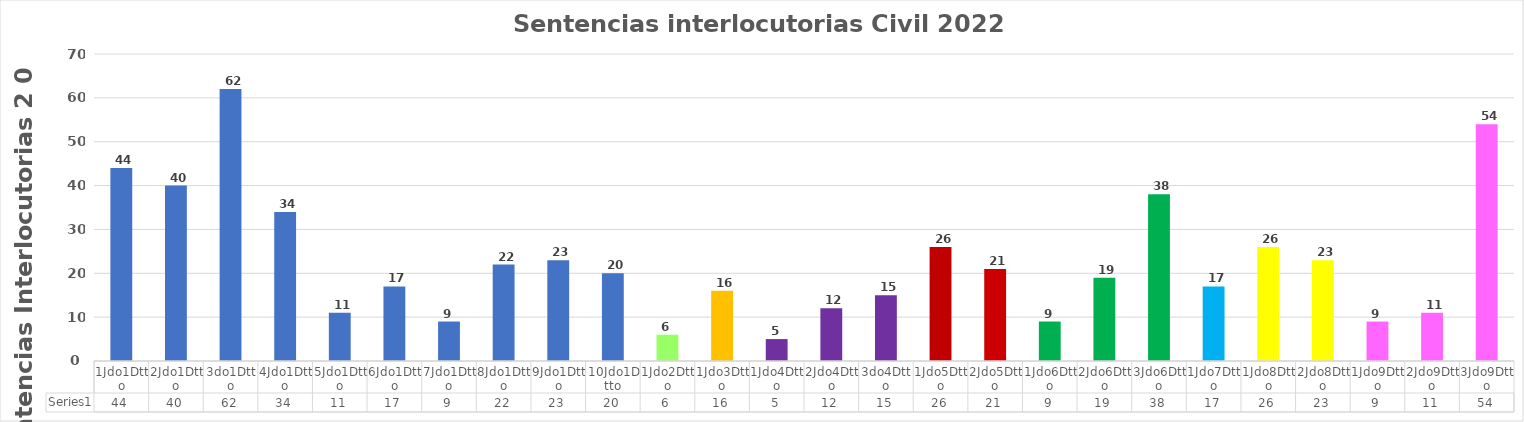
| Category | Series 0 |
|---|---|
| 1Jdo1Dtto | 44 |
| 2Jdo1Dtto | 40 |
| 3do1Dtto | 62 |
| 4Jdo1Dtto | 34 |
| 5Jdo1Dtto | 11 |
| 6Jdo1Dtto | 17 |
| 7Jdo1Dtto | 9 |
| 8Jdo1Dtto | 22 |
| 9Jdo1Dtto | 23 |
| 10Jdo1Dtto | 20 |
| 1Jdo2Dtto | 6 |
| 1Jdo3Dtto | 16 |
| 1Jdo4Dtto | 5 |
| 2Jdo4Dtto | 12 |
| 3do4Dtto | 15 |
| 1Jdo5Dtto | 26 |
| 2Jdo5Dtto | 21 |
| 1Jdo6Dtto | 9 |
| 2Jdo6Dtto | 19 |
| 3Jdo6Dtto | 38 |
| 1Jdo7Dtto | 17 |
| 1Jdo8Dtto | 26 |
| 2Jdo8Dtto | 23 |
| 1Jdo9Dtto | 9 |
| 2Jdo9Dtto | 11 |
| 3Jdo9Dtto | 54 |